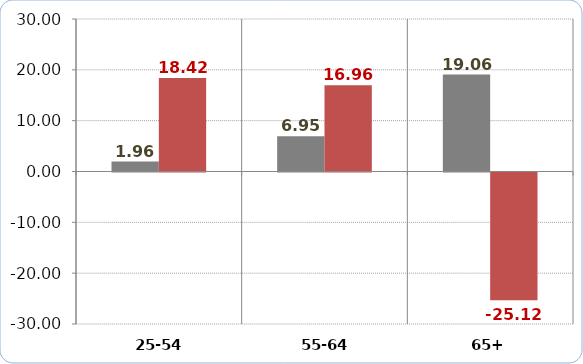
| Category | Real Income (07-15 percentage change) | People in Relative Poverty (07-15 percentage change) |
|---|---|---|
| 25-54 | 1.964 | 18.418 |
| 55-64 | 6.947 | 16.959 |
| 65+ | 19.062 | -25.116 |